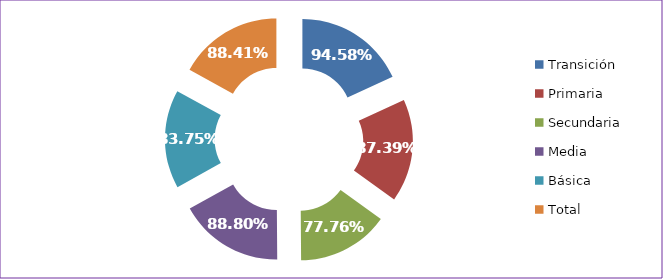
| Category | Tasa Aprobación |
|---|---|
| Transición | 0.946 |
| Primaria | 0.874 |
| Secundaria | 0.778 |
| Media | 0.888 |
| Básica | 0.838 |
| Total | 0.884 |